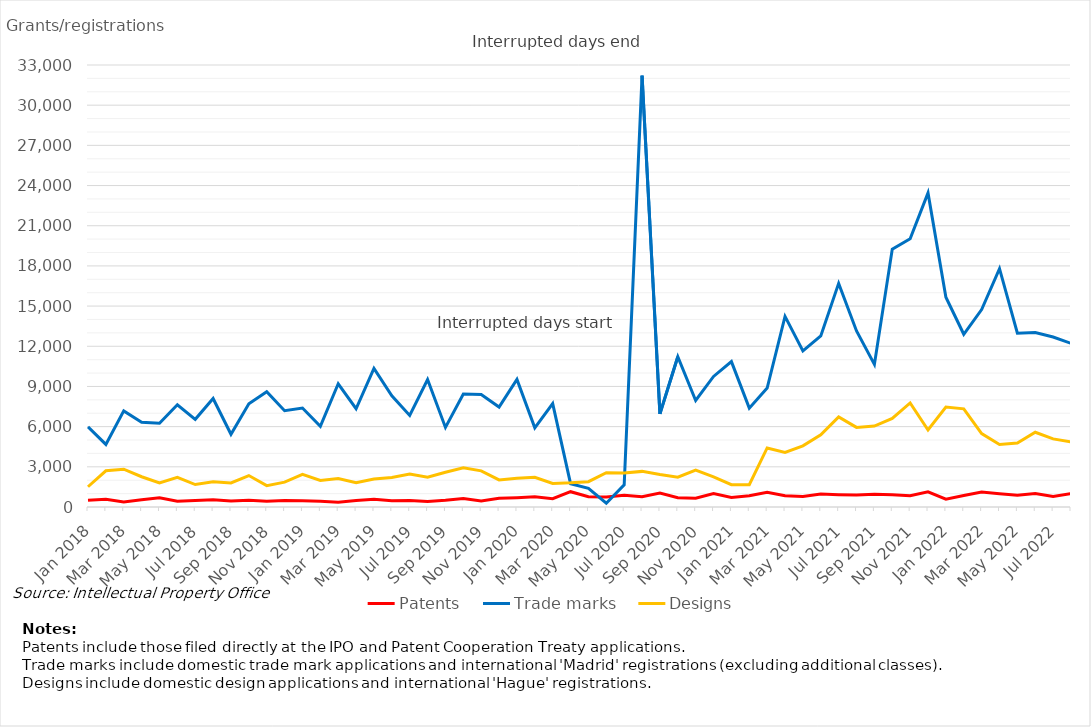
| Category | Patents | Trade marks | Designs |
|---|---|---|---|
| Jan 2018 | 495 | 5979 | 1512 |
| Feb 2018 | 574 | 4672 | 2704 |
| Mar 2018 | 370 | 7178 | 2825 |
| Apr 2018 | 543 | 6333 | 2259 |
| May 2018 | 690 | 6252 | 1789 |
| Jun 2018 | 424 | 7636 | 2222 |
| Jul 2018 | 486 | 6548 | 1678 |
| Aug 2018 | 536 | 8104 | 1878 |
| Sep 2018 | 450 | 5429 | 1795 |
| Oct 2018 | 498 | 7701 | 2348 |
| Nov 2018 | 432 | 8603 | 1592 |
| Dec 2018 | 484 | 7190 | 1859 |
| Jan 2019 | 474 | 7392 | 2444 |
| Feb 2019 | 426 | 6023 | 1987 |
| Mar 2019 | 363 | 9201 | 2125 |
| Apr 2019 | 488 | 7336 | 1810 |
| May 2019 | 573 | 10344 | 2096 |
| Jun 2019 | 471 | 8304 | 2202 |
| Jul 2019 | 489 | 6839 | 2464 |
| Aug 2019 | 420 | 9517 | 2218 |
| Sep 2019 | 500 | 5943 | 2596 |
| Oct 2019 | 634 | 8436 | 2926 |
| Nov 2019 | 455 | 8400 | 2700 |
| Dec 2019 | 654 | 7465 | 2021 |
| Jan 2020 | 696 | 9525 | 2145 |
| Feb 2020 | 756 | 5908 | 2220 |
| Mar 2020 | 622 | 7722 | 1757 |
| Apr 2020 | 1143 | 1742 | 1803 |
| May 2020 | 768 | 1399 | 1888 |
| Jun 2020 | 740 | 280 | 2564 |
| Jul 2020 | 878 | 1659 | 2539 |
| Aug 2020 | 771 | 32204 | 2659 |
| Sep 2020 | 1042 | 6949 | 2425 |
| Oct 2020 | 697 | 11221 | 2223 |
| Nov 2020 | 649 | 7954 | 2763 |
| Dec 2020 | 1010 | 9749 | 2252 |
| Jan 2021 | 708 | 10856 | 1665 |
| Feb 2021 | 838 | 7380 | 1660 |
| Mar 2021 | 1107 | 8877 | 4408 |
| Apr 2021 | 838 | 14232 | 4075 |
| May 2021 | 788 | 11654 | 4562 |
| Jun 2021 | 972 | 12771 | 5385 |
| Jul 2021 | 918 | 16695 | 6731 |
| Aug 2021 | 887 | 13145 | 5944 |
| Sep 2021 | 947 | 10649 | 6041 |
| Oct 2021 | 920 | 19252 | 6611 |
| Nov 2021 | 841 | 20029 | 7766 |
| Dec 2021 | 1131 | 23453 | 5752 |
| Jan 2022 | 585 | 15663 | 7459 |
| Feb 2022 | 860 | 12897 | 7331 |
| Mar 2022 | 1111 | 14744 | 5482 |
| Apr 2022 | 990 | 17791 | 4667 |
| May 2022 | 883 | 12975 | 4771 |
| Jun 2022 | 1010 | 13028 | 5580 |
| Jul 2022 | 788 | 12694 | 5083 |
| Aug 2022 | 1007 | 12218 | 4857 |